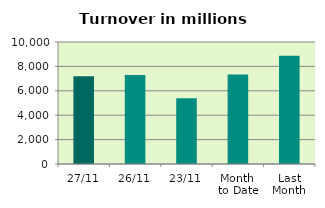
| Category | Series 0 |
|---|---|
| 27/11 | 7186.467 |
| 26/11 | 7291.222 |
| 23/11 | 5382.255 |
| Month 
to Date | 7331.996 |
| Last
Month | 8866.758 |